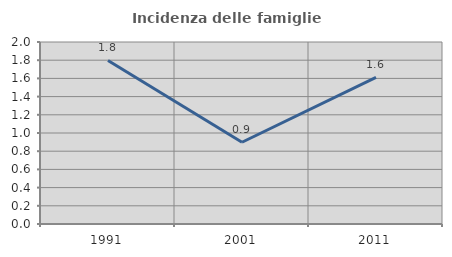
| Category | Incidenza delle famiglie numerose |
|---|---|
| 1991.0 | 1.797 |
| 2001.0 | 0.898 |
| 2011.0 | 1.611 |